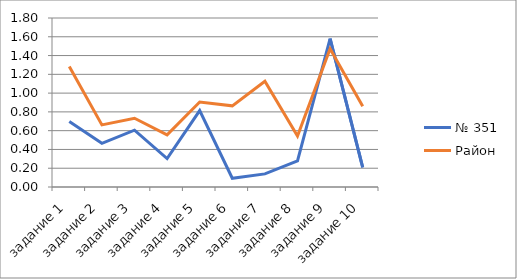
| Category | № 351 | Район |
|---|---|---|
| задание 1 | 0.698 | 1.284 |
| задание 2 | 0.465 | 0.661 |
| задание 3 | 0.605 | 0.733 |
| задание 4 | 0.302 | 0.555 |
| задание 5 | 0.814 | 0.906 |
| задание 6 | 0.093 | 0.865 |
| задание 7 | 0.14 | 1.127 |
| задание 8 | 0.279 | 0.543 |
| задание 9 | 1.581 | 1.472 |
| задание 10 | 0.209 | 0.859 |